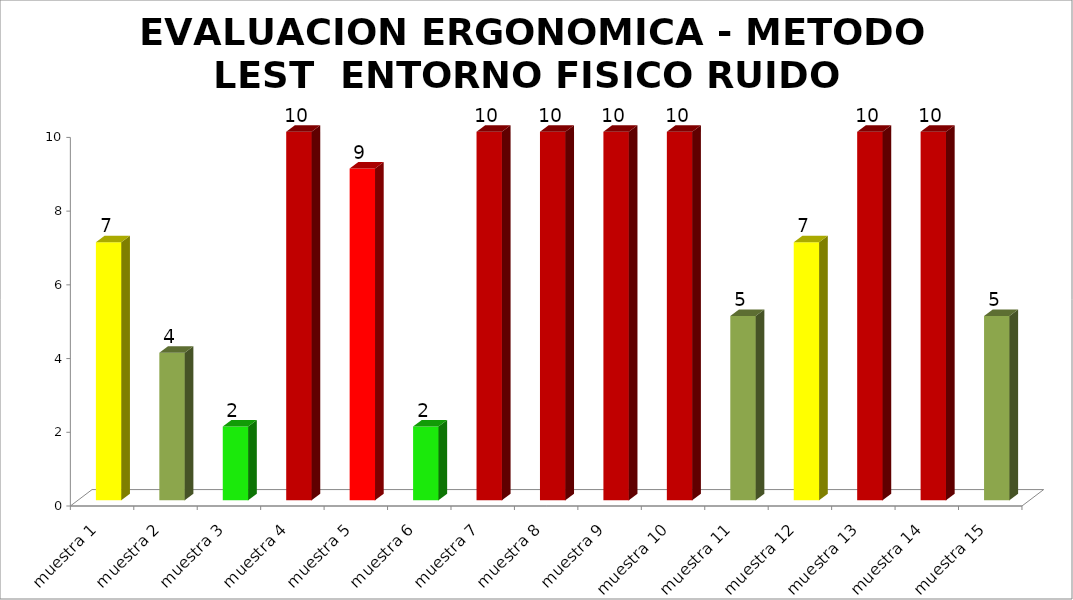
| Category | EVALUACION ERGONOMICA - METODO LEST  |
|---|---|
| muestra 1 | 7 |
| muestra 2 | 4 |
| muestra 3 | 2 |
| muestra 4 | 10 |
| muestra 5 | 9 |
| muestra 6 | 2 |
| muestra 7 | 10 |
| muestra 8 | 10 |
| muestra 9 | 10 |
| muestra 10 | 10 |
| muestra 11 | 5 |
| muestra 12 | 7 |
| muestra 13 | 10 |
| muestra 14 | 10 |
| muestra 15 | 5 |